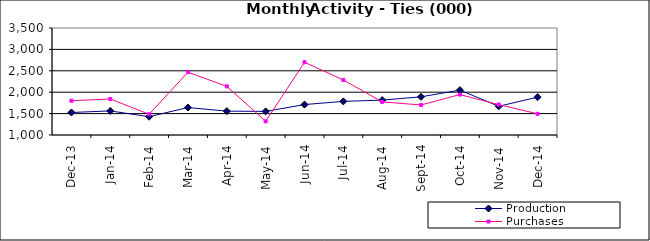
| Category | Production | Purchases |
|---|---|---|
| 2009-12-01 | 1525.855 | 1799.99 |
| 2010-01-01 | 1562.786 | 1842.078 |
| 2010-02-01 | 1428.045 | 1484.977 |
| 2010-03-01 | 1641.75 | 2467.773 |
| 2010-04-01 | 1557.532 | 2136.58 |
| 2010-05-01 | 1551.352 | 1319.681 |
| 2010-06-01 | 1711.075 | 2699.264 |
| 2010-07-01 | 1785.989 | 2286.137 |
| 2010-08-01 | 1815.515 | 1773.145 |
| 2010-09-01 | 1892.134 | 1701.848 |
| 2010-10-01 | 2048.585 | 1944.775 |
| 2010-11-01 | 1671.323 | 1710.018 |
| 2010-12-01 | 1883.808 | 1495.281 |